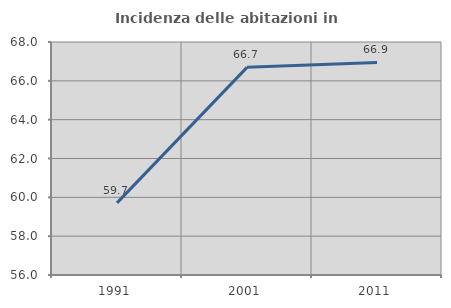
| Category | Incidenza delle abitazioni in proprietà  |
|---|---|
| 1991.0 | 59.714 |
| 2001.0 | 66.693 |
| 2011.0 | 66.948 |